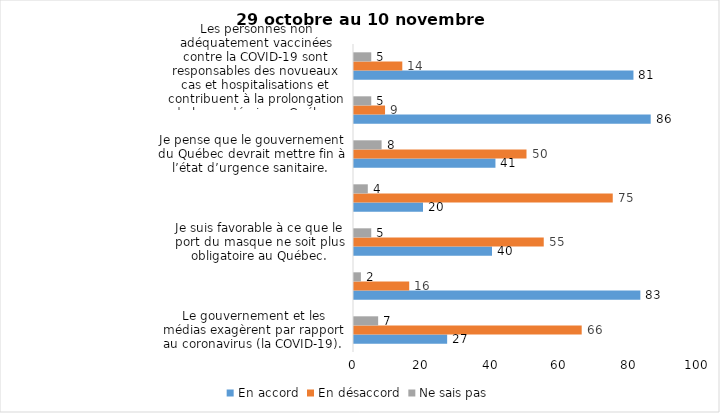
| Category | En accord | En désaccord | Ne sais pas |
|---|---|---|---|
| Le gouvernement et les médias exagèrent par rapport au coronavirus (la COVID-19). | 27 | 66 | 7 |
| Je suis favorable au passeport vaccinal qui permettrait l'accès à certains lieux ou activités aux personnes vaccinées. | 83 | 16 | 2 |
| Je suis favorable à ce que le port du masque ne soit plus obligatoire au Québec. | 40 | 55 | 5 |
| Je juge que les mesures contre la COVID-19 vont à l'encontre des droits et libertés individuelles.  | 20 | 75 | 4 |
| Je pense que le gouvernement du Québec devrait mettre fin à l’état d’urgence sanitaire.  | 41 | 50 | 8 |
| Les personnes adéquatement vaccinées contre la COVID-19 sont responsables et bienfaisantes envers la société. | 86 | 9 | 5 |
| Les personnes non adéquatement vaccinées contre la COVID-19 sont responsables des novueaux cas et hospitalisations et contribuent à la prolongation de la pandémie au Québec. | 81 | 14 | 5 |